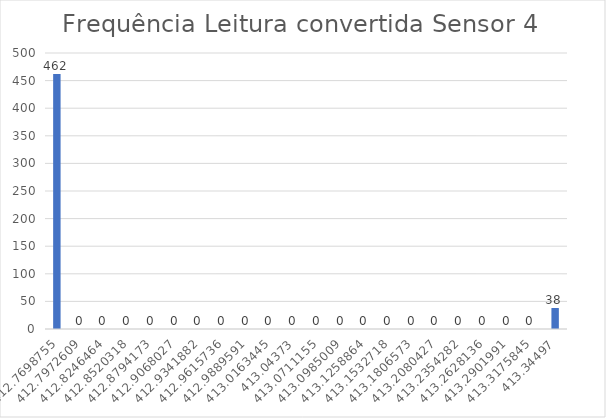
| Category | Series 0 |
|---|---|
| 412.76987545454546 | 462 |
| 412.7972609090909 | 0 |
| 412.82464636363636 | 0 |
| 412.8520318181818 | 0 |
| 412.87941727272727 | 0 |
| 412.9068027272727 | 0 |
| 412.9341881818182 | 0 |
| 412.9615736363636 | 0 |
| 412.9889590909091 | 0 |
| 413.0163445454545 | 0 |
| 413.04373 | 0 |
| 413.07111545454546 | 0 |
| 413.0985009090909 | 0 |
| 413.12588636363637 | 0 |
| 413.1532718181818 | 0 |
| 413.1806572727273 | 0 |
| 413.2080427272727 | 0 |
| 413.2354281818182 | 0 |
| 413.2628136363636 | 0 |
| 413.2901990909091 | 0 |
| 413.3175845454545 | 0 |
| 413.34497 | 38 |